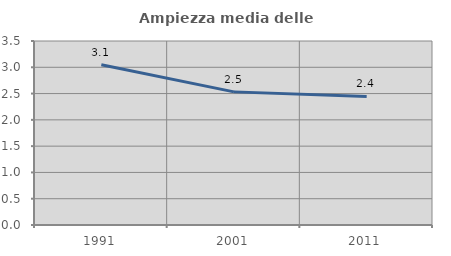
| Category | Ampiezza media delle famiglie |
|---|---|
| 1991.0 | 3.05 |
| 2001.0 | 2.532 |
| 2011.0 | 2.446 |